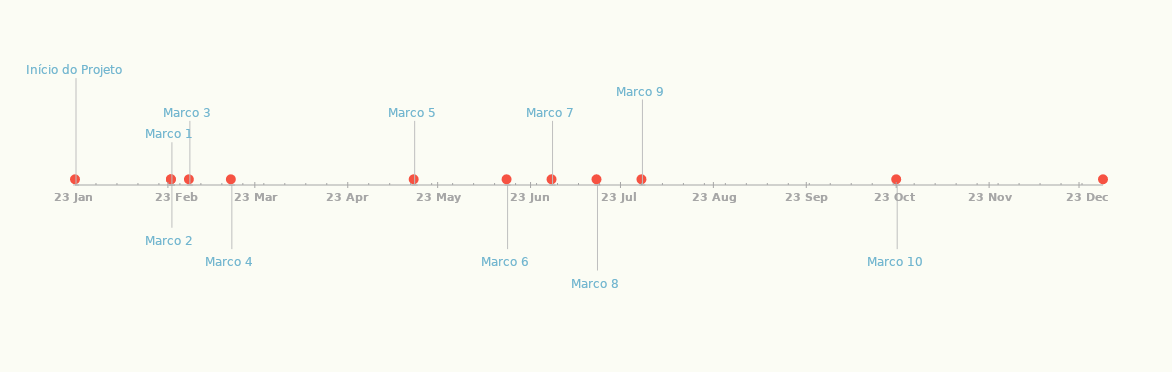
| Category | POSIÇÃO |
|---|---|
| Início do Projeto | 25 |
| Marco 1 | 10 |
| Marco 2 | -10 |
| Marco 3 | 15 |
| Marco 4 | -15 |
| Marco 5 | 15 |
| Marco 6 | -15 |
| Marco 7 | 15 |
| Marco 8 | -20 |
| Marco 9 | 20 |
| Marco 10 | -15 |
| Conclusão do Projeto | 15 |